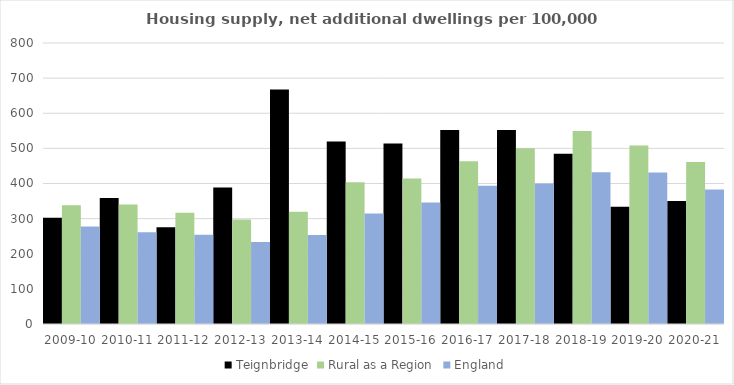
| Category | Teignbridge | Rural as a Region | England |
|---|---|---|---|
| 2009-10 | 302.368 | 337.852 | 277.548 |
| 2010-11 | 358.88 | 340.105 | 260.994 |
| 2011-12 | 275.205 | 317.04 | 254.007 |
| 2012-13 | 388.654 | 297.763 | 233.153 |
| 2013-14 | 667.788 | 319.835 | 253.602 |
| 2014-15 | 519.493 | 403.796 | 314.256 |
| 2015-16 | 513.564 | 414.091 | 346.154 |
| 2016-17 | 552.661 | 463.209 | 393.256 |
| 2017-18 | 552.356 | 500.68 | 399.646 |
| 2018-19 | 484.779 | 549.491 | 432.099 |
| 2019-20 | 333.922 | 508.493 | 431.187 |
| 2020-21 | 350.269 | 461.114 | 382.827 |